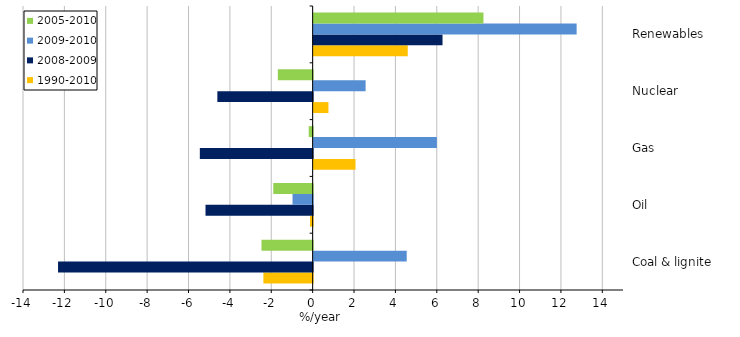
| Category | 1990-2010 | 2008-2009 | 2009-2010 | 2005-2010 |
|---|---|---|---|---|
| Coal & lignite | -2.382 | -12.307 | 4.498 | -2.472 |
| Oil | -0.127 | -5.179 | -0.973 | -1.904 |
| Gas | 2.024 | -5.453 | 5.956 | -0.189 |
| Nuclear | 0.714 | -4.606 | 2.512 | -1.683 |
| Renewables | 4.548 | 6.229 | 12.711 | 8.207 |